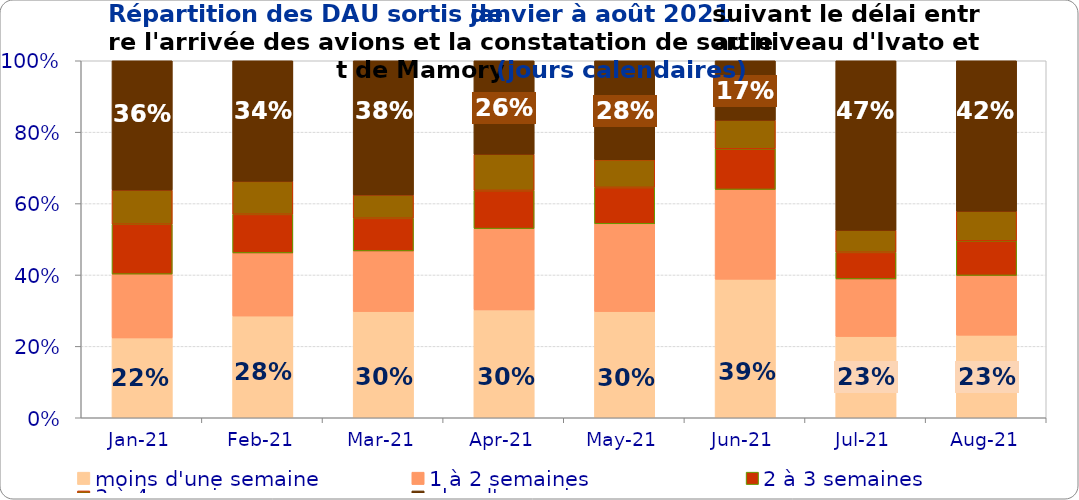
| Category | moins d'une semaine | 1 à 2 semaines | 2 à 3 semaines | 3 à 4 semaines | plus d'un mois |
|---|---|---|---|---|---|
| 2021-01-01 | 0.224 | 0.179 | 0.14 | 0.096 | 0.362 |
| 2021-02-01 | 0.285 | 0.177 | 0.108 | 0.092 | 0.338 |
| 2021-03-01 | 0.297 | 0.17 | 0.091 | 0.065 | 0.376 |
| 2021-04-01 | 0.302 | 0.228 | 0.107 | 0.101 | 0.262 |
| 2021-05-01 | 0.297 | 0.246 | 0.102 | 0.077 | 0.277 |
| 2021-06-01 | 0.388 | 0.251 | 0.114 | 0.08 | 0.167 |
| 2021-07-01 | 0.227 | 0.162 | 0.074 | 0.062 | 0.475 |
| 2021-08-01 | 0.231 | 0.167 | 0.097 | 0.083 | 0.421 |